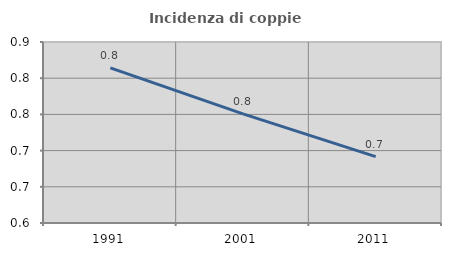
| Category | Incidenza di coppie miste |
|---|---|
| 1991.0 | 0.814 |
| 2001.0 | 0.751 |
| 2011.0 | 0.692 |